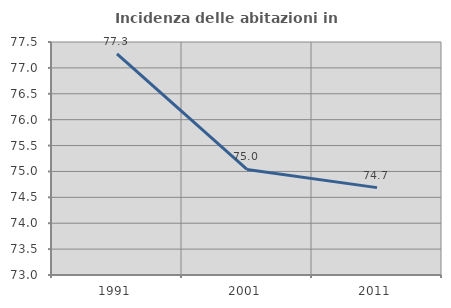
| Category | Incidenza delle abitazioni in proprietà  |
|---|---|
| 1991.0 | 77.273 |
| 2001.0 | 75.039 |
| 2011.0 | 74.688 |